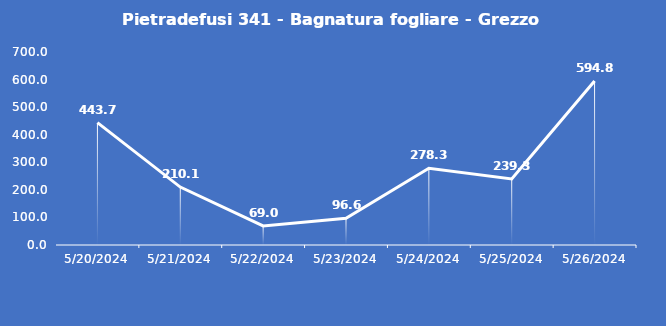
| Category | Pietradefusi 341 - Bagnatura fogliare - Grezzo (min) |
|---|---|
| 5/20/24 | 443.7 |
| 5/21/24 | 210.1 |
| 5/22/24 | 69 |
| 5/23/24 | 96.6 |
| 5/24/24 | 278.3 |
| 5/25/24 | 239.3 |
| 5/26/24 | 594.8 |